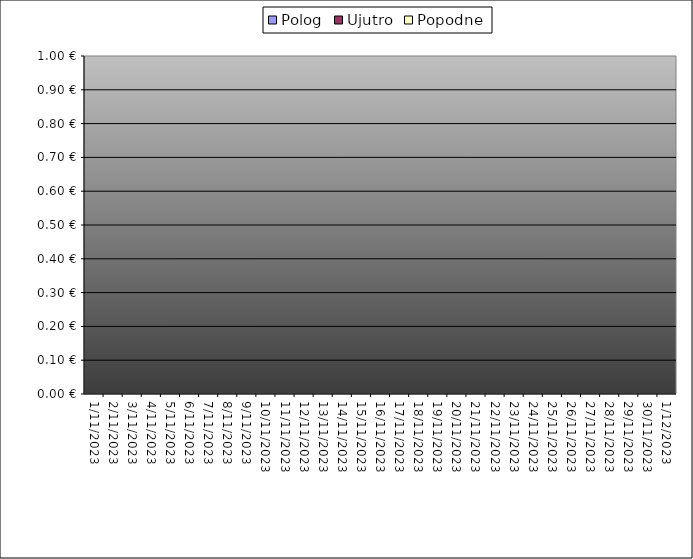
| Category | Polog | Ujutro | Popodne |
|---|---|---|---|
| 2023-11-01 |  | 0 | 0 |
| 2023-11-02 |  | 0 | 0 |
| 2023-11-03 |  | 0 | 0 |
| 2023-11-04 |  | 0 | 0 |
| 2023-11-05 |  | 0 | 0 |
| 2023-11-06 |  | 0 | 0 |
| 2023-11-07 |  | 0 | 0 |
| 2023-11-08 |  | 0 | 0 |
| 2023-11-09 |  | 0 | 0 |
| 2023-11-10 |  | 0 | 0 |
| 2023-11-11 |  | 0 | 0 |
| 2023-11-12 |  | 0 | 0 |
| 2023-11-13 |  | 0 | 0 |
| 2023-11-14 |  | 0 | 0 |
| 2023-11-15 |  | 0 | 0 |
| 2023-11-16 |  | 0 | 0 |
| 2023-11-17 |  | 0 | 0 |
| 2023-11-18 |  | 0 | 0 |
| 2023-11-19 |  | 0 | 0 |
| 2023-11-20 |  | 0 | 0 |
| 2023-11-21 |  | 0 | 0 |
| 2023-11-22 |  | 0 | 0 |
| 2023-11-23 |  | 0 | 0 |
| 2023-11-24 |  | 0 | 0 |
| 2023-11-25 |  | 0 | 0 |
| 2023-11-26 |  | 0 | 0 |
| 2023-11-27 |  | 0 | 0 |
| 2023-11-28 |  | 0 | 0 |
| 2023-11-29 |  | 0 | 0 |
| 2023-11-30 |  | 0 | 0 |
| 2023-12-01 |  | 0 | 0 |